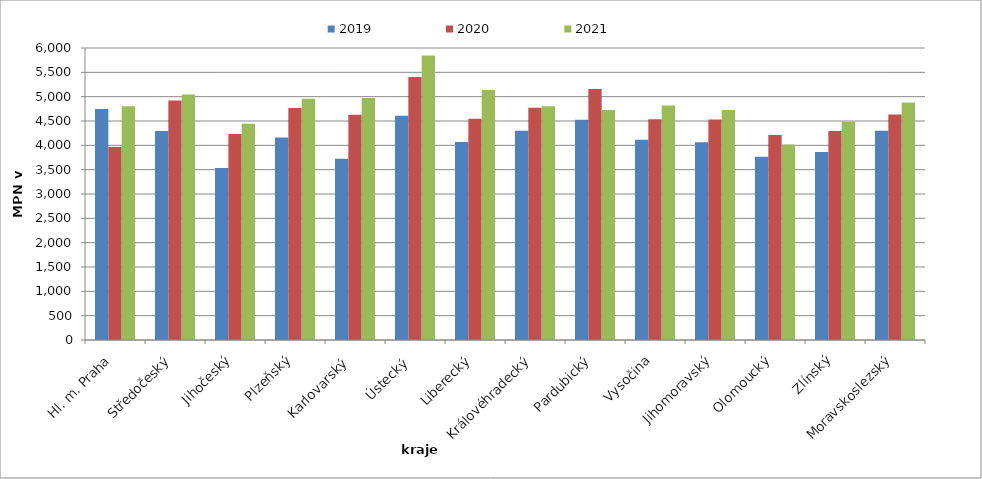
| Category | 2019 | 2020 | 2021 |
|---|---|---|---|
| Hl. m. Praha | 4749 | 3966 | 4805 |
| Středočeský | 4294 | 4919 | 5044 |
| Jihočeský | 3532 | 4234 | 4441 |
| Plzeňský | 4160 | 4769 | 4956 |
| Karlovarský  | 3725 | 4626 | 4974 |
| Ústecký   | 4610 | 5405 | 5848 |
| Liberecký | 4067 | 4546 | 5135 |
| Královéhradecký | 4299 | 4772 | 4802 |
| Pardubický | 4526 | 5159 | 4724 |
| Vysočina | 4113 | 4538 | 4816 |
| Jihomoravský | 4062 | 4530 | 4726 |
| Olomoucký | 3765 | 4210 | 4015 |
| Zlínský | 3861 | 4294 | 4483 |
| Moravskoslezský | 4301 | 4633 | 4881 |